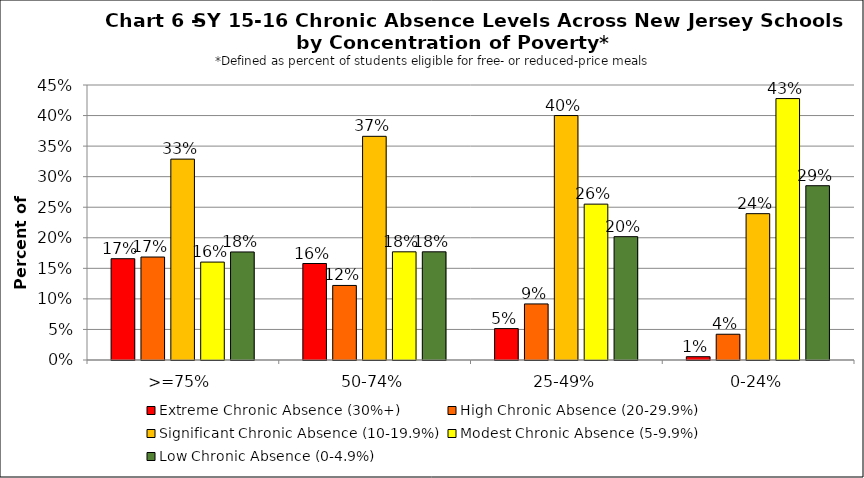
| Category | Extreme Chronic Absence (30%+) | High Chronic Absence (20-29.9%) | Significant Chronic Absence (10-19.9%) | Modest Chronic Absence (5-9.9%) | Low Chronic Absence (0-4.9%) |
|---|---|---|---|---|---|
| 0 | 0.166 | 0.169 | 0.329 | 0.16 | 0.177 |
| 1 | 0.158 | 0.122 | 0.366 | 0.177 | 0.177 |
| 2 | 0.051 | 0.092 | 0.4 | 0.255 | 0.202 |
| 3 | 0.005 | 0.042 | 0.239 | 0.428 | 0.285 |